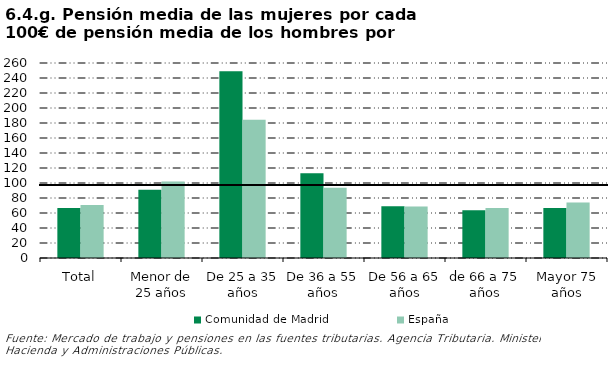
| Category | Comunidad de Madrid | España |
|---|---|---|
| Total | 66.605 | 70.647 |
| Menor de 25 años | 90.98 | 101.878 |
| De 25 a 35 años | 249.156 | 184.325 |
| De 36 a 55 años | 113.001 | 93.743 |
| De 56 a 65 años | 69.048 | 68.721 |
| de 66 a 75 años | 63.745 | 66.629 |
| Mayor 75 años | 66.815 | 74.104 |